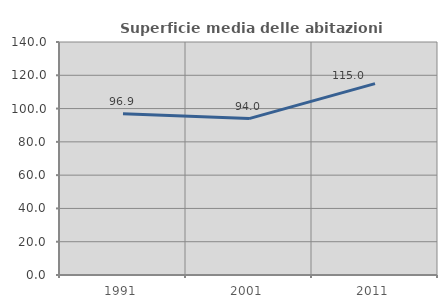
| Category | Superficie media delle abitazioni occupate |
|---|---|
| 1991.0 | 96.948 |
| 2001.0 | 93.984 |
| 2011.0 | 114.986 |